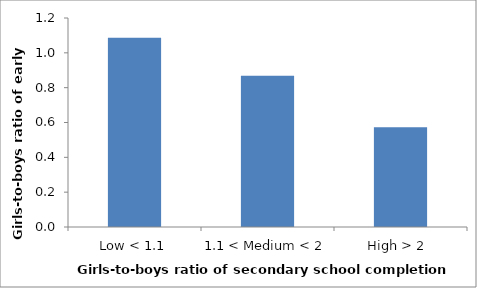
| Category | Girls-to-boys ratio of secondary school completion rates |
|---|---|
| Low < 1.1 | 1.086 |
| 1.1 < Medium < 2 | 0.869 |
| High > 2  | 0.573 |